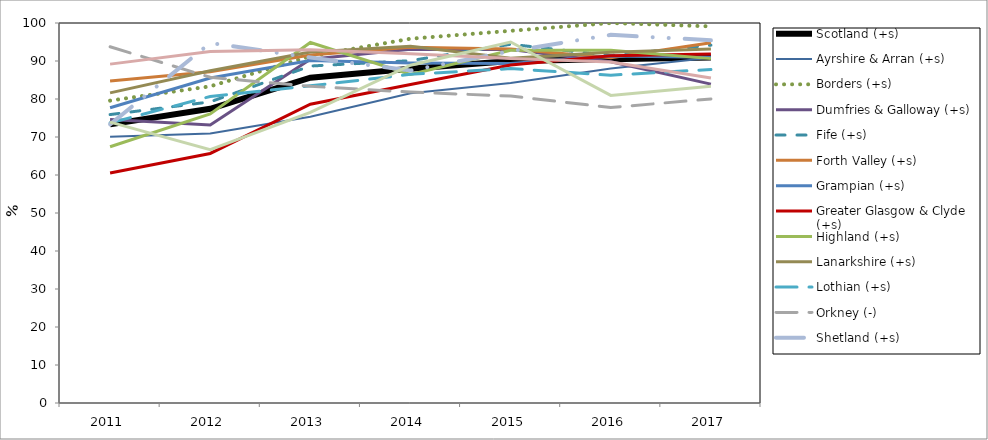
| Category | Scotland (+s) | Ayrshire & Arran (+s) | Borders (+s) | Dumfries & Galloway (+s) | Fife (+s) | Forth Valley (+s) | Grampian (+s) | Greater Glasgow & Clyde (+s) | Highland (+s) | Lanarkshire (+s) | Lothian (+s) | Orkney (-) | Shetland (+s) | Tayside (-s) | Western Isles (+) |
|---|---|---|---|---|---|---|---|---|---|---|---|---|---|---|---|
| 2011.0 | 73.329 | 70.04 | 79.57 | 74.595 | 75.901 | 84.726 | 77.698 | 60.512 | 67.429 | 81.605 | 73.691 | 93.75 | 73.333 | 89.176 | 73.913 |
| 2012.0 | 77.434 | 70.928 | 83.333 | 73.171 | 79.245 | 87.166 | 85.539 | 65.673 | 76.052 | 87.421 | 80.669 | 85.714 | 94.737 | 92.494 | 66.667 |
| 2013.0 | 85.607 | 75.322 | 91.25 | 90.449 | 88.671 | 91.549 | 90.157 | 78.625 | 94.872 | 92.365 | 83.466 | 83.333 | 90.909 | 92.941 | 76.471 |
| 2014.0 | 87.955 | 81.538 | 95.862 | 93.082 | 90.086 | 93.6 | 89.461 | 83.826 | 86.486 | 93.855 | 86.486 | 81.818 | 87.5 | 91.922 | 88.889 |
| 2015.0 | 90 | 84.211 | 97.945 | 93.023 | 94.407 | 93.137 | 89.316 | 88.918 | 92.81 | 90.751 | 88 | 80.769 | 92.593 | 90.633 | 95 |
| 2016.0 | 90.488 | 88.026 | 100 | 89.781 | 91.416 | 90.863 | 91.304 | 91.36 | 92.857 | 92.275 | 86.263 | 77.778 | 96.875 | 89.749 | 80.952 |
| 2017.0 | 90.948 | 90.84 | 99.107 | 83.908 | 94.172 | 94.819 | 90.985 | 91.832 | 90.625 | 93.169 | 87.769 | 80 | 95.455 | 85.55 | 83.333 |